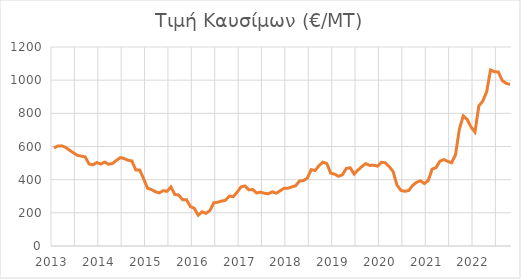
| Category | Τιμή Καυσίμων |
|---|---|
| 2013.0 | 591.6 |
| 2013.0 | 602.85 |
| 2013.0 | 603.95 |
| 2013.0 | 594.9 |
| 2013.0 | 577.3 |
| 2013.0 | 561.9 |
| 2013.0 | 546.75 |
| 2013.0 | 542.15 |
| 2013.0 | 537.35 |
| 2013.0 | 494.95 |
| 2013.0 | 489.2 |
| 2014.0 | 503.3 |
| 2014.0 | 494.15 |
| 2014.0 | 506 |
| 2014.0 | 493.05 |
| 2014.0 | 497.1 |
| 2014.0 | 515.75 |
| 2014.0 | 532.9 |
| 2014.0 | 527.6 |
| 2014.0 | 517.05 |
| 2014.0 | 512.8 |
| 2014.0 | 458.45 |
| 2014.0 | 458.1 |
| 2015.0 | 405.95 |
| 2015.0 | 348.65 |
| 2015.0 | 340.5 |
| 2015.0 | 327.35 |
| 2015.0 | 320.2 |
| 2015.0 | 333.4 |
| 2015.0 | 329.8 |
| 2015.0 | 355.95 |
| 2015.0 | 310.9 |
| 2015.0 | 306.95 |
| 2015.0 | 279.25 |
| 2015.0 | 279.6 |
| 2016.0 | 237.75 |
| 2016.0 | 227.2 |
| 2016.0 | 185.5 |
| 2016.0 | 206.4 |
| 2016.0 | 196.95 |
| 2016.0 | 213.7 |
| 2016.0 | 260.75 |
| 2016.0 | 263.75 |
| 2016.0 | 271 |
| 2016.0 | 276.05 |
| 2016.0 | 301.35 |
| 2016.0 | 297.75 |
| 2017.0 | 324.75 |
| 2017.0 | 356.85 |
| 2017.0 | 362.05 |
| 2017.0 | 339.05 |
| 2017.0 | 340.2 |
| 2017.0 | 319.55 |
| 2017.0 | 324.85 |
| 2017.0 | 318.2 |
| 2017.0 | 314.7 |
| 2017.0 | 327 |
| 2017.0 | 318.2 |
| 2017.0 | 332.95 |
| 2018.0 | 347.75 |
| 2018.0 | 347.88 |
| 2018.0 | 356.29 |
| 2018.0 | 363.31 |
| 2018.0 | 391.92 |
| 2018.0 | 394.42 |
| 2018.0 | 409.36 |
| 2018.0 | 460.37 |
| 2018.0 | 455.47 |
| 2018.0 | 484.29 |
| 2018.0 | 505.47 |
| 2018.0 | 496.81 |
| 2019.0 | 439.15 |
| 2019.0 | 433.24 |
| 2019.0 | 420.39 |
| 2019.0 | 429.6 |
| 2019.0 | 467.97 |
| 2019.0 | 471.41 |
| 2019.0 | 433.97 |
| 2019.0 | 457.92 |
| 2019.0 | 479.4 |
| 2019.0 | 497.16 |
| 2019.0 | 485.64 |
| 2019.0 | 487.54 |
| 2020.0 | 481.63 |
| 2020.0 | 505.02 |
| 2020.0 | 501.73 |
| 2020.0 | 479.04 |
| 2020.0 | 449.12 |
| 2020.0 | 367.01 |
| 2020.0 | 335.41 |
| 2020.0 | 329.81 |
| 2020.0 | 334.59 |
| 2020.0 | 365.1 |
| 2020.0 | 383.66 |
| 2020.0 | 393.35 |
| 2021.0 | 376.47 |
| 2021.0 | 394.22 |
| 2021.0 | 463.24 |
| 2021.0 | 472.31 |
| 2021.0 | 511.12 |
| 2021.0 | 521.31 |
| 2021.0 | 510.42 |
| 2021.0 | 501.69 |
| 2021.0 | 549.06 |
| 2021.0 | 705.16 |
| 2021.0 | 784.59 |
| 2021.0 | 762.96 |
| 2022.0 | 716.93 |
| 2022.0 | 687.06 |
| 2022.0 | 845.4 |
| 2022.0 | 873.58 |
| 2022.0 | 930.29 |
| 2022.0 | 1061.5 |
| 2022.0 | 1050.8 |
| 2022.0 | 1049.47 |
| 2022.0 | 997.33 |
| 2022.0 | 980.8 |
| 2022.0 | 974.54 |